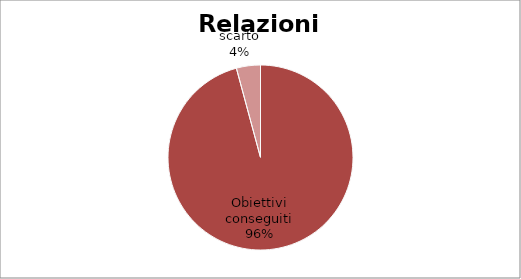
| Category | Series 0 |
|---|---|
| Obiettivi conseguiti | 95.8 |
| scarto | 4.2 |